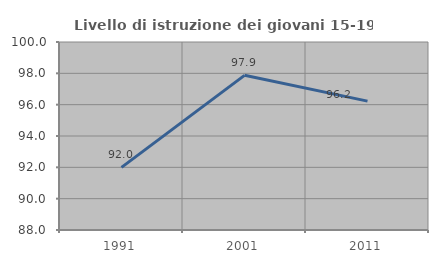
| Category | Livello di istruzione dei giovani 15-19 anni |
|---|---|
| 1991.0 | 92 |
| 2001.0 | 97.872 |
| 2011.0 | 96.226 |